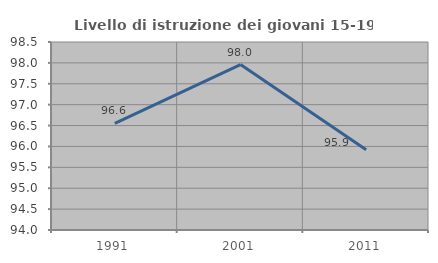
| Category | Livello di istruzione dei giovani 15-19 anni |
|---|---|
| 1991.0 | 96.552 |
| 2001.0 | 97.959 |
| 2011.0 | 95.918 |